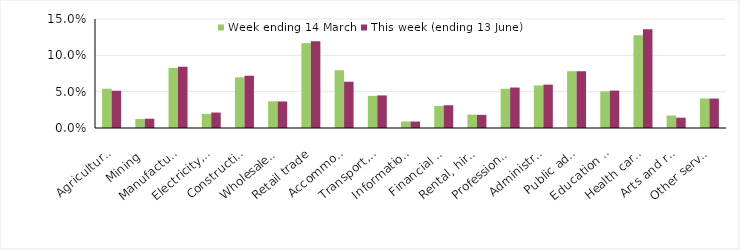
| Category | Week ending 14 March | This week (ending 13 June) |
|---|---|---|
| Agriculture, forestry and fishing | 0.054 | 0.051 |
| Mining | 0.012 | 0.013 |
| Manufacturing | 0.083 | 0.084 |
| Electricity, gas, water and waste services | 0.019 | 0.021 |
| Construction | 0.07 | 0.072 |
| Wholesale trade | 0.037 | 0.037 |
| Retail trade | 0.117 | 0.119 |
| Accommodation and food services | 0.079 | 0.064 |
| Transport, postal and warehousing | 0.044 | 0.045 |
| Information media and telecommunications | 0.009 | 0.009 |
| Financial and insurance services | 0.03 | 0.031 |
| Rental, hiring and real estate services | 0.018 | 0.018 |
| Professional, scientific and technical services | 0.054 | 0.056 |
| Administrative and support services | 0.059 | 0.06 |
| Public administration and safety | 0.078 | 0.078 |
| Education and training | 0.05 | 0.051 |
| Health care and social assistance | 0.128 | 0.136 |
| Arts and recreation services | 0.017 | 0.014 |
| Other services | 0.041 | 0.041 |